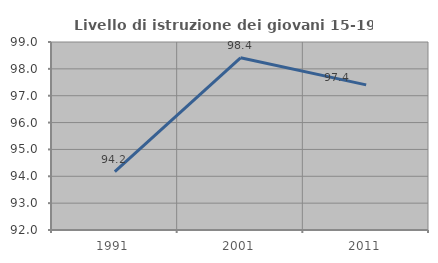
| Category | Livello di istruzione dei giovani 15-19 anni |
|---|---|
| 1991.0 | 94.175 |
| 2001.0 | 98.413 |
| 2011.0 | 97.403 |